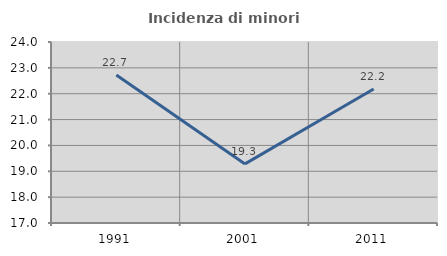
| Category | Incidenza di minori stranieri |
|---|---|
| 1991.0 | 22.727 |
| 2001.0 | 19.286 |
| 2011.0 | 22.181 |